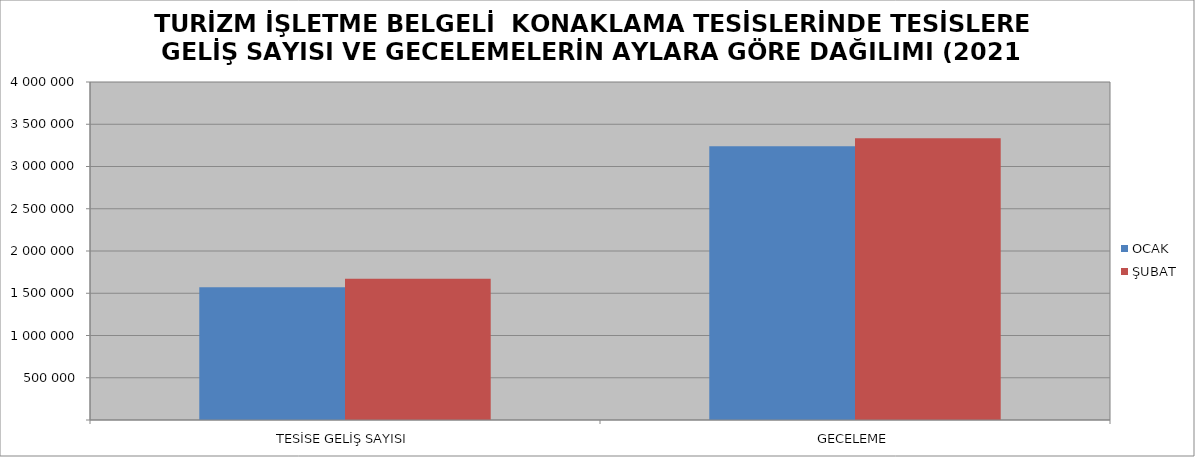
| Category | OCAK | ŞUBAT |
|---|---|---|
| TESİSE GELİŞ SAYISI | 1571594 | 1670164 |
| GECELEME | 3239980 | 3333484 |